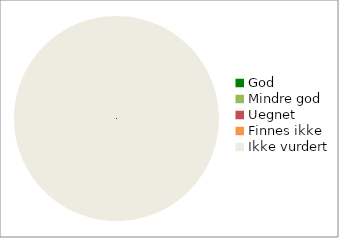
| Category | Series 0 |
|---|---|
| God | 0 |
| Mindre god | 0 |
| Uegnet | 0 |
| Finnes ikke | 0 |
| Ikke vurdert | 128 |